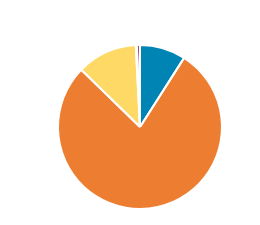
| Category | Series 0 |
|---|---|
| PC/MC | 5963 |
| CAR/LGV | 51640 |
| OGV1 & PSV 2Axle | 7852 |
| OGV1 & PSV 3 Axle | 130 |
| OGV2 | 411 |